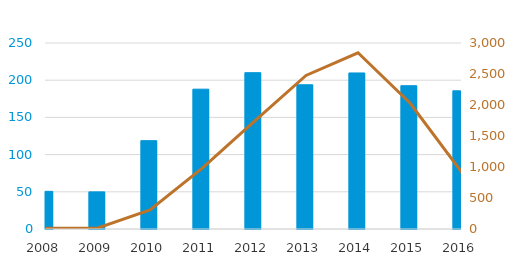
| Category | mean |
|---|---|
| 2008.0 | 50.629 |
| 2009.0 | 49.894 |
| 2010.0 | 118.76 |
| 2011.0 | 187.933 |
| 2012.0 | 210.112 |
| 2013.0 | 193.849 |
| 2014.0 | 209.729 |
| 2015.0 | 192.596 |
| 2016.0 | 185.727 |